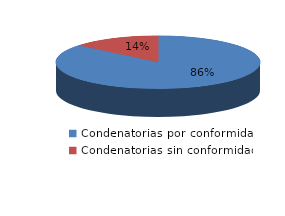
| Category | Series 0 |
|---|---|
| 0 | 43 |
| 1 | 7 |